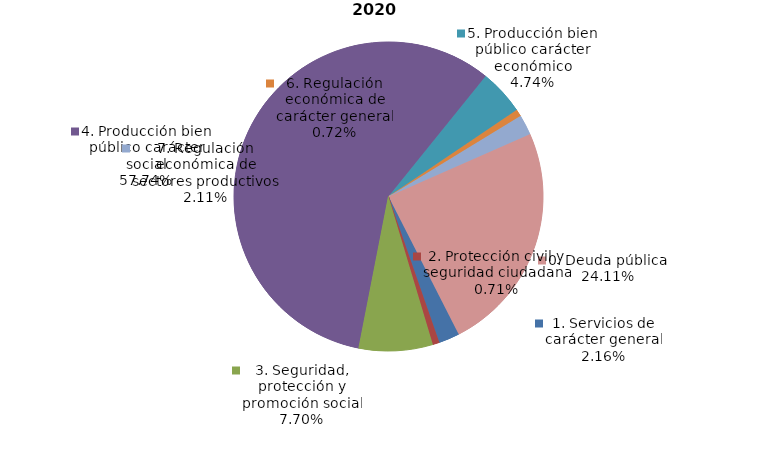
| Category | 2019 |
|---|---|
| 1. Servicios de carácter general | 133060703 |
| 2. Protección civil y seguridad ciudadana | 43714318 |
| 3. Seguridad, protección y promoción social | 474521698 |
| 4. Producción bien público carácter social | 3557641507 |
| 5. Producción bien público carácter económico | 291816984 |
| 6. Regulación económica de carácter general | 44617101 |
| 7. Regulación económica de sectores productivos | 130032815 |
| 0. Deuda pública | 1485614050 |